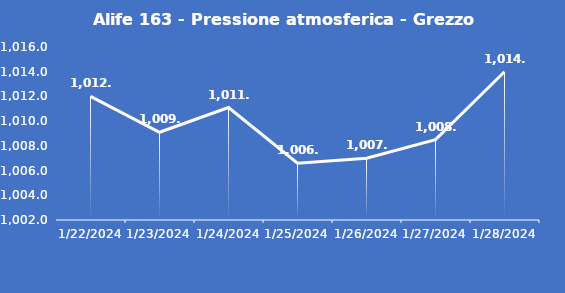
| Category | Alife 163 - Pressione atmosferica - Grezzo (hPa) |
|---|---|
| 1/22/24 | 1012 |
| 1/23/24 | 1009.1 |
| 1/24/24 | 1011.1 |
| 1/25/24 | 1006.6 |
| 1/26/24 | 1007 |
| 1/27/24 | 1008.5 |
| 1/28/24 | 1014 |